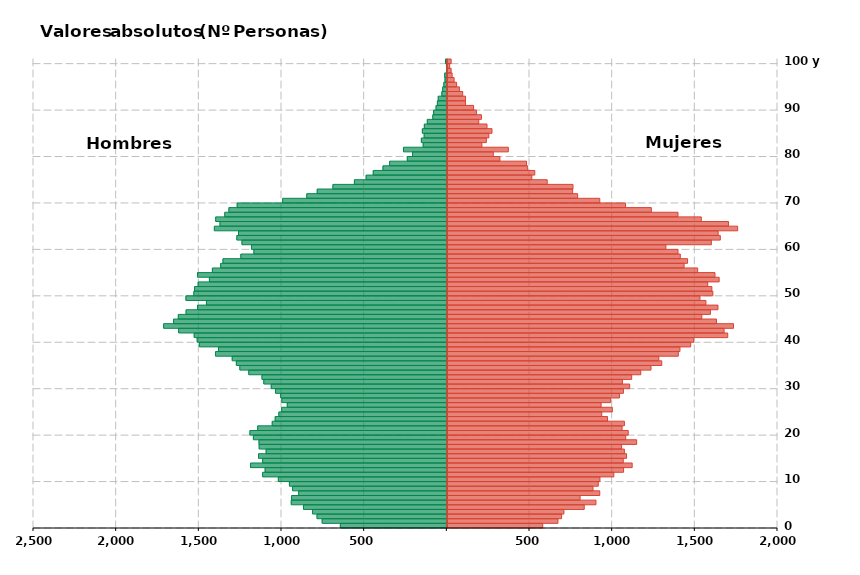
| Category | Hombres | Mujeres |
|---|---|---|
| 0 | -644 | 577 |
| 1 | -754 | 669 |
| 2 | -785 | 691 |
| 3 | -812 | 705 |
| 4 | -867 | 828 |
| 5 | -941 | 899 |
| 6 | -939 | 803 |
| 7 | -896 | 922 |
| 8 | -933 | 881 |
| 9 | -952 | 913 |
| 10 | -1019 | 923 |
| 11 | -1114 | 1007 |
| 12 | -1099 | 1066 |
| 13 | -1187 | 1118 |
| 14 | -1114 | 1064 |
| 15 | -1139 | 1084 |
| 16 | -1093 | 1071 |
| 17 | -1135 | 1054 |
| 18 | -1136 | 1145 |
| 19 | -1170 | 1079 |
| 20 | -1191 | 1094 |
| 21 | -1144 | 1057 |
| 22 | -1056 | 1071 |
| 23 | -1038 | 969 |
| 24 | -1016 | 934 |
| 25 | -999 | 998 |
| 26 | -965 | 930 |
| 27 | -998 | 988 |
| 28 | -1005 | 1041 |
| 29 | -1036 | 1065 |
| 30 | -1062 | 1103 |
| 31 | -1107 | 1059 |
| 32 | -1118 | 1115 |
| 33 | -1198 | 1170 |
| 34 | -1252 | 1232 |
| 35 | -1273 | 1297 |
| 36 | -1298 | 1279 |
| 37 | -1399 | 1397 |
| 38 | -1381 | 1407 |
| 39 | -1497 | 1472 |
| 40 | -1510 | 1490 |
| 41 | -1528 | 1696 |
| 42 | -1622 | 1674 |
| 43 | -1713 | 1731 |
| 44 | -1653 | 1628 |
| 45 | -1624 | 1539 |
| 46 | -1577 | 1591 |
| 47 | -1508 | 1637 |
| 48 | -1454 | 1564 |
| 49 | -1578 | 1528 |
| 50 | -1530 | 1606 |
| 51 | -1526 | 1600 |
| 52 | -1504 | 1575 |
| 53 | -1436 | 1644 |
| 54 | -1508 | 1619 |
| 55 | -1418 | 1514 |
| 56 | -1368 | 1432 |
| 57 | -1354 | 1453 |
| 58 | -1246 | 1409 |
| 59 | -1167 | 1395 |
| 60 | -1181 | 1322 |
| 61 | -1239 | 1597 |
| 62 | -1270 | 1651 |
| 63 | -1260 | 1638 |
| 64 | -1406 | 1756 |
| 65 | -1372 | 1701 |
| 66 | -1398 | 1536 |
| 67 | -1343 | 1395 |
| 68 | -1318 | 1234 |
| 69 | -1268 | 1078 |
| 70 | -993 | 922 |
| 71 | -847 | 788 |
| 72 | -784 | 758 |
| 73 | -689 | 760 |
| 74 | -559 | 604 |
| 75 | -488 | 511 |
| 76 | -445 | 529 |
| 77 | -386 | 486 |
| 78 | -346 | 479 |
| 79 | -239 | 318 |
| 80 | -207 | 278 |
| 81 | -262 | 369 |
| 82 | -143 | 209 |
| 83 | -154 | 236 |
| 84 | -137 | 251 |
| 85 | -148 | 270 |
| 86 | -136 | 240 |
| 87 | -118 | 190 |
| 88 | -85 | 206 |
| 89 | -80 | 176 |
| 90 | -65 | 159 |
| 91 | -57 | 110 |
| 92 | -52 | 110 |
| 93 | -30 | 93 |
| 94 | -25 | 73 |
| 95 | -18 | 56 |
| 96 | -11 | 41 |
| 97 | -13 | 29 |
| 98 | -2 | 23 |
| 99 | -2 | 14 |
| 100 | -8 | 23 |